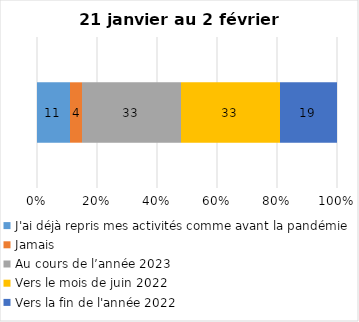
| Category | J'ai déjà repris mes activités comme avant la pandémie | Jamais | Au cours de l’année 2023 | Vers le mois de juin 2022 | Vers la fin de l'année 2022 |
|---|---|---|---|---|---|
| 0 | 11 | 4 | 33 | 33 | 19 |